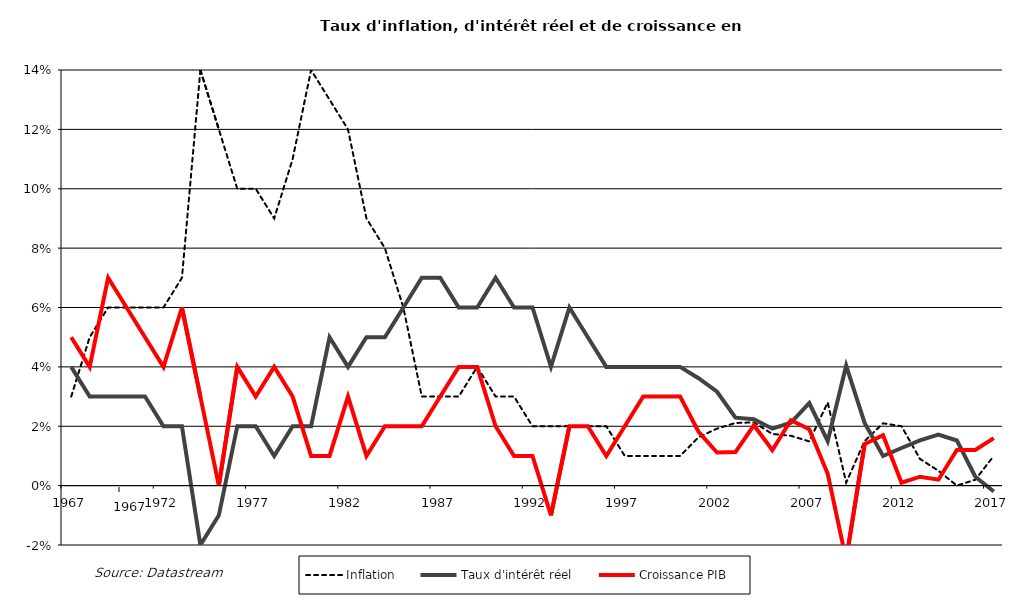
| Category | Inflation | Taux d'intérêt réel | Croissance PIB |
|---|---|---|---|
| 1967.0 | 0.03 | 0.04 | 0.05 |
| 1968.0 | 0.05 | 0.03 | 0.04 |
| 1969.0 | 0.06 | 0.03 | 0.07 |
| 1970.0 | 0.06 | 0.03 | 0.06 |
| 1971.0 | 0.06 | 0.03 | 0.05 |
| 1972.0 | 0.06 | 0.02 | 0.04 |
| 1973.0 | 0.07 | 0.02 | 0.06 |
| 1974.0 | 0.14 | -0.02 | 0.03 |
| 1975.0 | 0.12 | -0.01 | 0 |
| 1976.0 | 0.1 | 0.02 | 0.04 |
| 1977.0 | 0.1 | 0.02 | 0.03 |
| 1978.0 | 0.09 | 0.01 | 0.04 |
| 1979.0 | 0.11 | 0.02 | 0.03 |
| 1980.0 | 0.14 | 0.02 | 0.01 |
| 1981.0 | 0.13 | 0.05 | 0.01 |
| 1982.0 | 0.12 | 0.04 | 0.03 |
| 1983.0 | 0.09 | 0.05 | 0.01 |
| 1984.0 | 0.08 | 0.05 | 0.02 |
| 1985.0 | 0.06 | 0.06 | 0.02 |
| 1986.0 | 0.03 | 0.07 | 0.02 |
| 1987.0 | 0.03 | 0.07 | 0.03 |
| 1988.0 | 0.03 | 0.06 | 0.04 |
| 1989.0 | 0.04 | 0.06 | 0.04 |
| 1990.0 | 0.03 | 0.07 | 0.02 |
| 1991.0 | 0.03 | 0.06 | 0.01 |
| 1992.0 | 0.02 | 0.06 | 0.01 |
| 1993.0 | 0.02 | 0.04 | -0.01 |
| 1994.0 | 0.02 | 0.06 | 0.02 |
| 1995.0 | 0.02 | 0.05 | 0.02 |
| 1996.0 | 0.02 | 0.04 | 0.01 |
| 1997.0 | 0.01 | 0.04 | 0.02 |
| 1998.0 | 0.01 | 0.04 | 0.03 |
| 1999.0 | 0.01 | 0.04 | 0.03 |
| 2000.0 | 0.01 | 0.04 | 0.03 |
| 2001.0 | 0.016 | 0.036 | 0.018 |
| 2002.0 | 0.019 | 0.032 | 0.011 |
| 2003.0 | 0.021 | 0.023 | 0.011 |
| 2004.0 | 0.021 | 0.022 | 0.02 |
| 2005.0 | 0.017 | 0.019 | 0.012 |
| 2006.0 | 0.017 | 0.021 | 0.022 |
| 2007.0 | 0.015 | 0.028 | 0.019 |
| 2008.0 | 0.028 | 0.015 | 0.004 |
| 2009.0 | 0.001 | 0.04 | -0.025 |
| 2010.0 | 0.015 | 0.021 | 0.014 |
| 2011.0 | 0.021 | 0.01 | 0.017 |
| 2012.0 | 0.02 | 0.013 | 0.001 |
| 2013.0 | 0.009 | 0.015 | 0.003 |
| 2014.0 | 0.005 | 0.017 | 0.002 |
| 2015.0 | 0 | 0.015 | 0.012 |
| 2016.0 | 0.002 | 0.003 | 0.012 |
| 2017.0 | 0.01 | -0.002 | 0.016 |